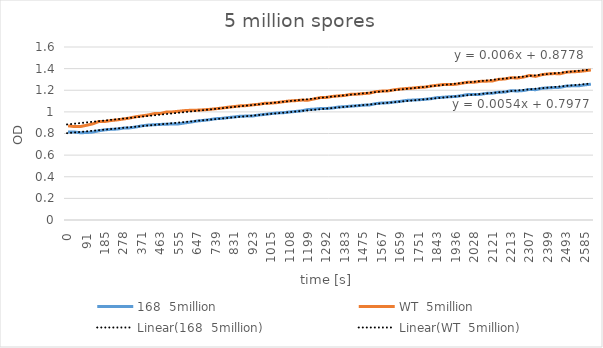
| Category | 168  5million | WT  5million |
|---|---|---|
| 0.0 | 0.813 | 0.871 |
| 30.0 | 0.814 | 0.864 |
| 61.0 | 0.807 | 0.864 |
| 91.0 | 0.809 | 0.876 |
| 122.0 | 0.813 | 0.889 |
| 153.0 | 0.825 | 0.911 |
| 185.0 | 0.834 | 0.911 |
| 216.0 | 0.839 | 0.92 |
| 246.0 | 0.841 | 0.926 |
| 278.0 | 0.85 | 0.934 |
| 309.0 | 0.852 | 0.943 |
| 341.0 | 0.86 | 0.955 |
| 371.0 | 0.871 | 0.963 |
| 402.0 | 0.878 | 0.971 |
| 432.0 | 0.881 | 0.984 |
| 463.0 | 0.884 | 0.985 |
| 494.0 | 0.886 | 0.999 |
| 525.0 | 0.888 | 1 |
| 555.0 | 0.889 | 1.006 |
| 586.0 | 0.898 | 1.012 |
| 617.0 | 0.906 | 1.015 |
| 647.0 | 0.916 | 1.016 |
| 678.0 | 0.921 | 1.019 |
| 708.0 | 0.928 | 1.023 |
| 739.0 | 0.937 | 1.029 |
| 770.0 | 0.94 | 1.035 |
| 800.0 | 0.947 | 1.043 |
| 831.0 | 0.953 | 1.049 |
| 862.0 | 0.96 | 1.056 |
| 893.0 | 0.961 | 1.058 |
| 923.0 | 0.962 | 1.065 |
| 954.0 | 0.971 | 1.07 |
| 985.0 | 0.977 | 1.08 |
| 1015.0 | 0.984 | 1.081 |
| 1046.0 | 0.99 | 1.086 |
| 1076.0 | 0.992 | 1.094 |
| 1108.0 | 0.999 | 1.101 |
| 1139.0 | 1.004 | 1.104 |
| 1169.0 | 1.01 | 1.109 |
| 1199.0 | 1.022 | 1.108 |
| 1230.0 | 1.025 | 1.12 |
| 1261.0 | 1.031 | 1.132 |
| 1292.0 | 1.031 | 1.134 |
| 1323.0 | 1.036 | 1.143 |
| 1353.0 | 1.045 | 1.148 |
| 1383.0 | 1.048 | 1.152 |
| 1414.0 | 1.053 | 1.163 |
| 1444.0 | 1.057 | 1.164 |
| 1475.0 | 1.062 | 1.169 |
| 1505.0 | 1.064 | 1.173 |
| 1536.0 | 1.076 | 1.187 |
| 1567.0 | 1.082 | 1.192 |
| 1598.0 | 1.084 | 1.194 |
| 1629.0 | 1.091 | 1.204 |
| 1659.0 | 1.097 | 1.211 |
| 1690.0 | 1.106 | 1.216 |
| 1720.0 | 1.109 | 1.22 |
| 1751.0 | 1.112 | 1.226 |
| 1782.0 | 1.116 | 1.229 |
| 1813.0 | 1.122 | 1.239 |
| 1843.0 | 1.132 | 1.246 |
| 1874.0 | 1.135 | 1.253 |
| 1905.0 | 1.14 | 1.252 |
| 1936.0 | 1.142 | 1.255 |
| 1967.0 | 1.15 | 1.265 |
| 1997.0 | 1.161 | 1.274 |
| 2028.0 | 1.16 | 1.274 |
| 2059.0 | 1.162 | 1.282 |
| 2090.0 | 1.171 | 1.284 |
| 2121.0 | 1.173 | 1.286 |
| 2151.0 | 1.182 | 1.301 |
| 2182.0 | 1.183 | 1.304 |
| 2213.0 | 1.196 | 1.316 |
| 2244.0 | 1.193 | 1.313 |
| 2276.0 | 1.197 | 1.321 |
| 2307.0 | 1.208 | 1.337 |
| 2337.0 | 1.205 | 1.328 |
| 2368.0 | 1.218 | 1.344 |
| 2399.0 | 1.222 | 1.351 |
| 2431.0 | 1.225 | 1.354 |
| 2462.0 | 1.227 | 1.353 |
| 2493.0 | 1.239 | 1.367 |
| 2523.0 | 1.241 | 1.371 |
| 2554.0 | 1.241 | 1.373 |
| 2585.0 | 1.25 | 1.38 |
| 2616.0 | 1.256 | 1.387 |